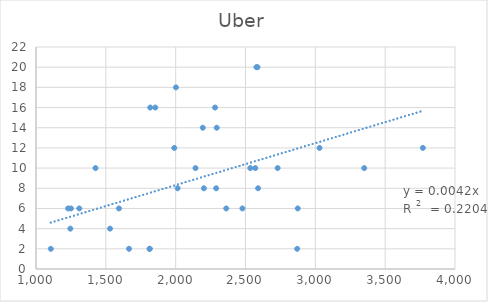
| Category | Uber |
|---|---|
| 2202.0 | 8 |
| 1310.0 | 6 |
| 2194.0 | 14 |
| 1106.0 | 2 |
| 1814.0 | 2 |
| 2002.0 | 18 |
| 2362.0 | 6 |
| 1230.0 | 6 |
| 2586.0 | 20 |
| 1854.0 | 16 |
| 2534.0 | 10 |
| 2570.0 | 10 |
| 1246.0 | 4 |
| 1990.0 | 12 |
| 1594.0 | 6 |
| 2578.0 | 20 |
| 1530.0 | 4 |
| 2478.0 | 6 |
| 1666.0 | 2 |
| 2282.0 | 16 |
| 2142.0 | 10 |
| 3030.0 | 12 |
| 2590.0 | 8 |
| 2874.0 | 6 |
| 2014.0 | 8 |
| 3350.0 | 10 |
| 1250.0 | 6 |
| 2870.0 | 2 |
| 1814.0 | 2 |
| 3770.0 | 12 |
| 2294.0 | 14 |
| 2730.0 | 10 |
| 2290.0 | 8 |
| 1818.0 | 16 |
| 1426.0 | 10 |